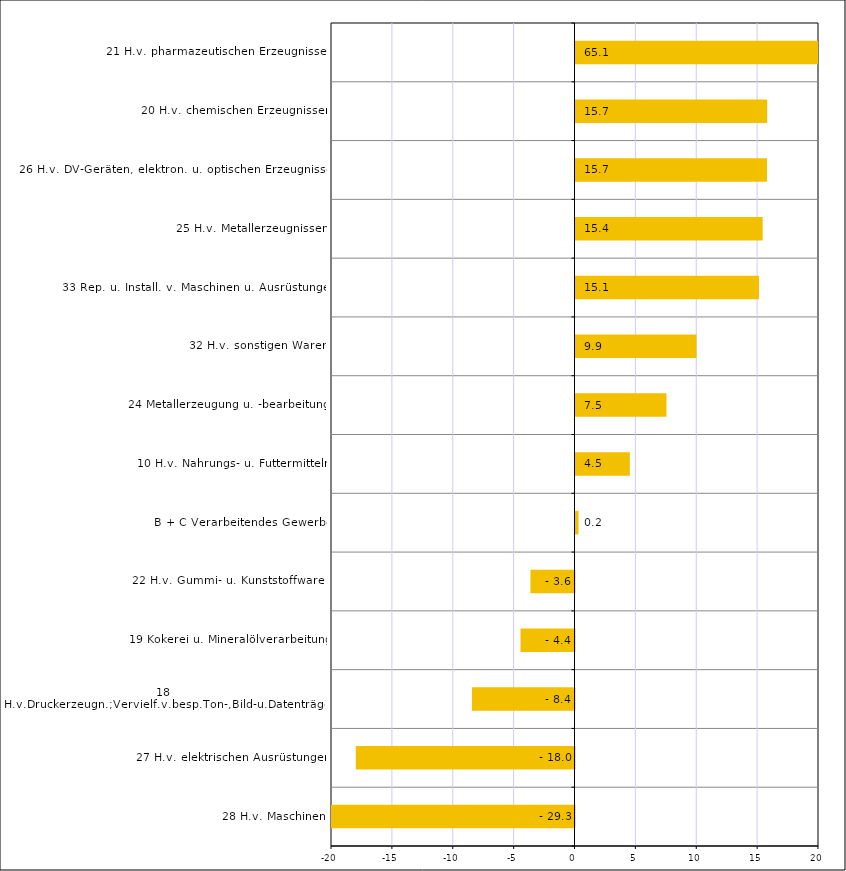
| Category | Series 0 |
|---|---|
| 28 H.v. Maschinen | -29.346 |
| 27 H.v. elektrischen Ausrüstungen | -17.962 |
| 18 H.v.Druckerzeugn.;Vervielf.v.besp.Ton-,Bild-u.Datenträgern | -8.422 |
| 19 Kokerei u. Mineralölverarbeitung | -4.435 |
| 22 H.v. Gummi- u. Kunststoffwaren | -3.617 |
| B + C Verarbeitendes Gewerbe | 0.25 |
| 10 H.v. Nahrungs- u. Futtermitteln | 4.464 |
| 24 Metallerzeugung u. -bearbeitung | 7.472 |
| 32 H.v. sonstigen Waren | 9.939 |
| 33 Rep. u. Install. v. Maschinen u. Ausrüstungen | 15.069 |
| 25 H.v. Metallerzeugnissen | 15.375 |
| 26 H.v. DV-Geräten, elektron. u. optischen Erzeugnissen | 15.727 |
| 20 H.v. chemischen Erzeugnissen | 15.742 |
| 21 H.v. pharmazeutischen Erzeugnissen | 65.088 |